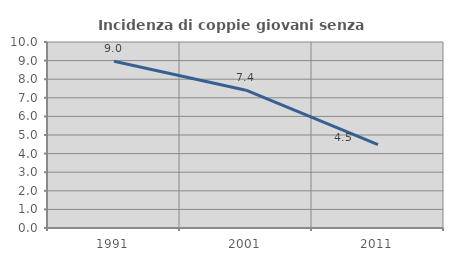
| Category | Incidenza di coppie giovani senza figli |
|---|---|
| 1991.0 | 8.967 |
| 2001.0 | 7.408 |
| 2011.0 | 4.484 |